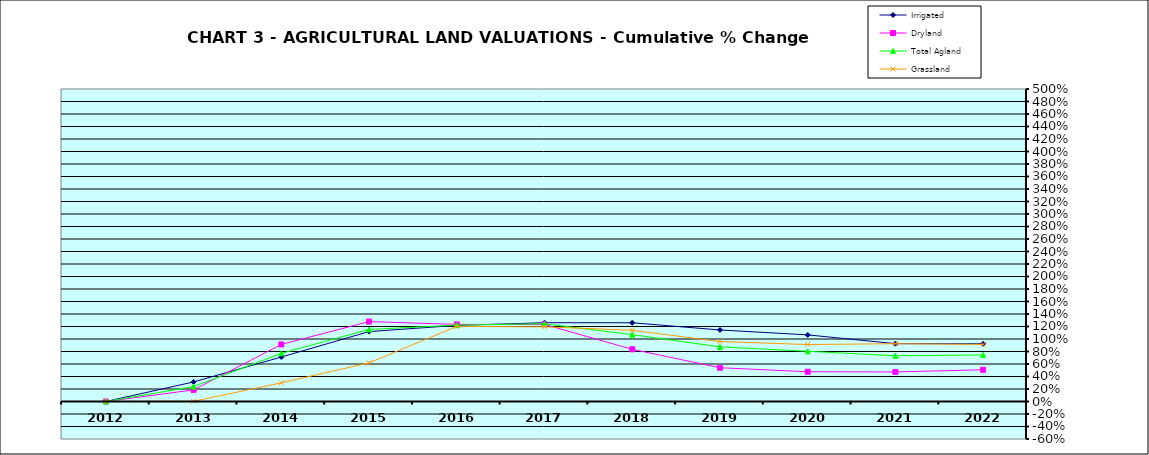
| Category | Irrigated | Dryland | Total Agland | Grassland |
|---|---|---|---|---|
| 2012.0 | 0 | 0 | 0 | 0 |
| 2013.0 | 0.313 | 0.186 | 0.238 | 0.003 |
| 2014.0 | 0.712 | 0.913 | 0.77 | 0.299 |
| 2015.0 | 1.118 | 1.279 | 1.153 | 0.618 |
| 2016.0 | 1.218 | 1.233 | 1.222 | 1.202 |
| 2017.0 | 1.26 | 1.233 | 1.243 | 1.195 |
| 2018.0 | 1.26 | 0.835 | 1.07 | 1.14 |
| 2019.0 | 1.145 | 0.54 | 0.874 | 0.959 |
| 2020.0 | 1.066 | 0.476 | 0.804 | 0.912 |
| 2021.0 | 0.926 | 0.473 | 0.732 | 0.925 |
| 2022.0 | 0.923 | 0.507 | 0.745 | 0.913 |